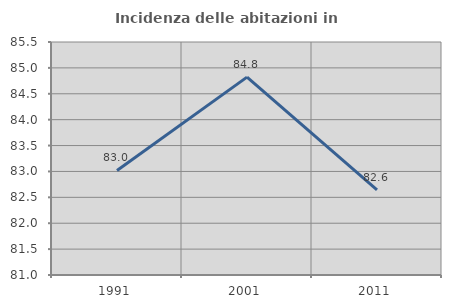
| Category | Incidenza delle abitazioni in proprietà  |
|---|---|
| 1991.0 | 83.019 |
| 2001.0 | 84.821 |
| 2011.0 | 82.645 |